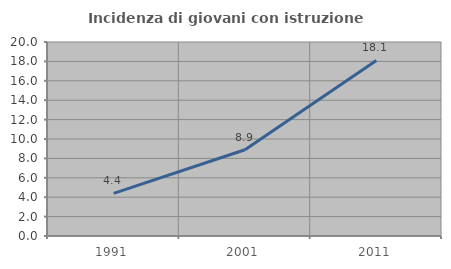
| Category | Incidenza di giovani con istruzione universitaria |
|---|---|
| 1991.0 | 4.388 |
| 2001.0 | 8.889 |
| 2011.0 | 18.102 |